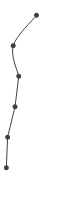
| Category | Series 0 |
|---|---|
| 0.49925332296358066 | 1 |
| 0.11692231559684761 | 2 |
| 0.20781396197351848 | 3 |
| 0.14661091656332578 | 4 |
| 0.0248750077742569 | 5 |
| 0.004012934962981764 | 6 |